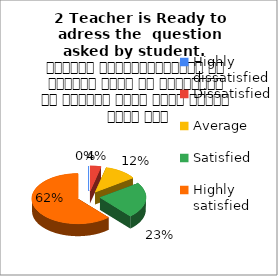
| Category | 2 Teacher is Ready to adress the  question asked by student.   शिक्षक विद्यार्थियों के द्वारा पूछे गए प्रश्नों का समाधान करने हेतु तत्पर रहते हैं |
|---|---|
| Highly dissatisfied | 0 |
| Dissatisfied | 1 |
| Average | 3 |
| Satisfied | 6 |
| Highly satisfied | 16 |